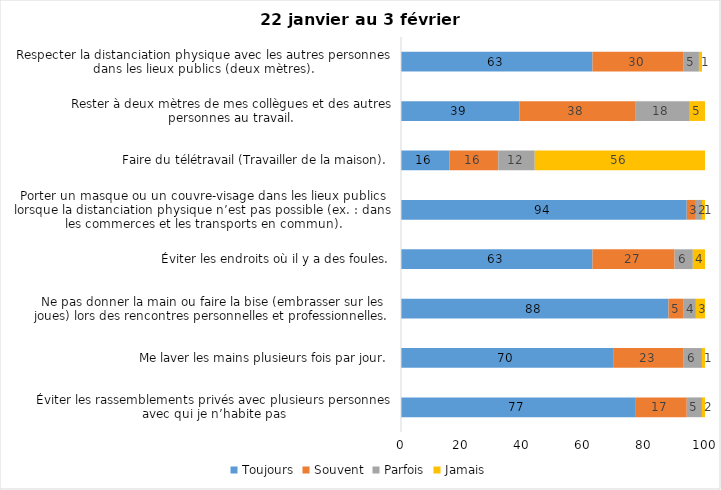
| Category | Toujours | Souvent | Parfois | Jamais |
|---|---|---|---|---|
| Éviter les rassemblements privés avec plusieurs personnes avec qui je n’habite pas | 77 | 17 | 5 | 2 |
| Me laver les mains plusieurs fois par jour. | 70 | 23 | 6 | 1 |
| Ne pas donner la main ou faire la bise (embrasser sur les joues) lors des rencontres personnelles et professionnelles. | 88 | 5 | 4 | 3 |
| Éviter les endroits où il y a des foules. | 63 | 27 | 6 | 4 |
| Porter un masque ou un couvre-visage dans les lieux publics lorsque la distanciation physique n’est pas possible (ex. : dans les commerces et les transports en commun). | 94 | 3 | 2 | 1 |
| Faire du télétravail (Travailler de la maison). | 16 | 16 | 12 | 56 |
| Rester à deux mètres de mes collègues et des autres personnes au travail. | 39 | 38 | 18 | 5 |
| Respecter la distanciation physique avec les autres personnes dans les lieux publics (deux mètres). | 63 | 30 | 5 | 1 |